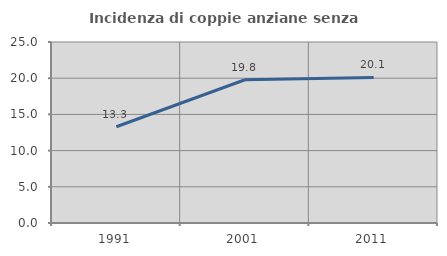
| Category | Incidenza di coppie anziane senza figli  |
|---|---|
| 1991.0 | 13.29 |
| 2001.0 | 19.782 |
| 2011.0 | 20.108 |